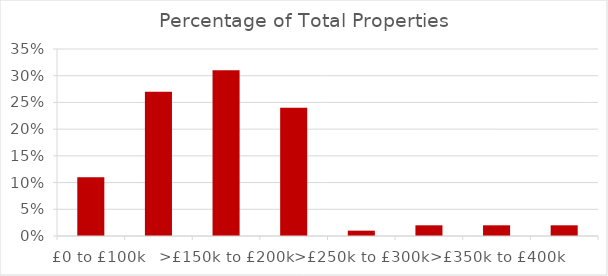
| Category | Percentage of Total Properties (%) |
|---|---|
|    £0 to £100k | 0.11 |
| >£100k to £150k | 0.27 |
| >£150k to £200k | 0.31 |
| >£200k to £250k | 0.24 |
| >£250k to £300k | 0.01 |
| >£300k to £350k | 0.02 |
| >£350k to £400k | 0.02 |
| >£400k to £450k | 0.02 |